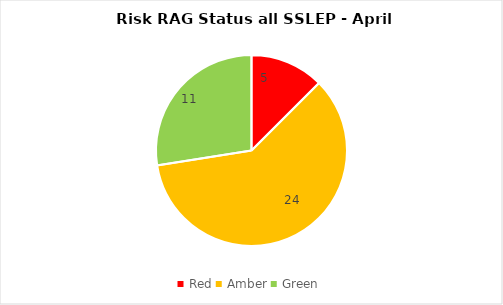
| Category | SSLEP |
|---|---|
| Red | 5 |
| Amber | 24 |
| Green | 11 |